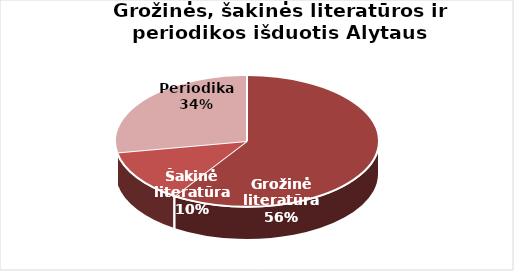
| Category | Series 0 |
|---|---|
| Grožinė literatūra | 380808 |
| Šakinė literatūra | 83069 |
| Periodika | 178839 |